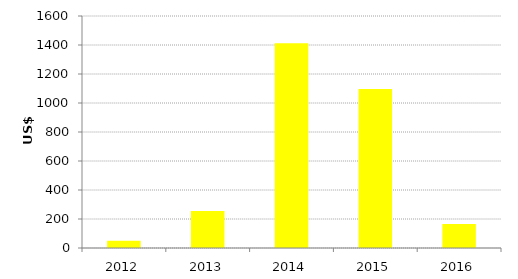
| Category | US$ millions |
|---|---|
| 2012.0 | 50.109 |
| 2013.0 | 254.38 |
| 2014.0 | 1411.884 |
| 2015.0 | 1095.767 |
| 2016.0 | 166.063 |